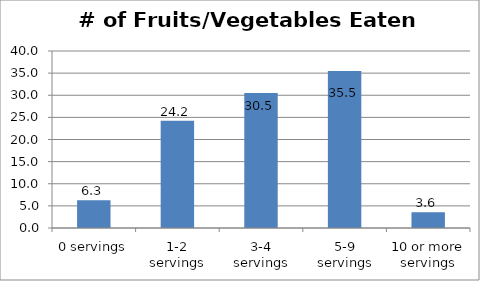
| Category | Series 0 |
|---|---|
| 0 servings | 6.251 |
| 1-2 servings | 24.217 |
| 3-4 servings | 30.484 |
| 5-9 servings | 35.489 |
| 10 or more servings | 3.559 |